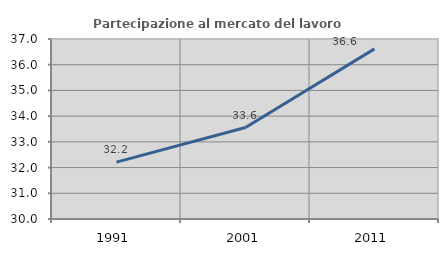
| Category | Partecipazione al mercato del lavoro  femminile |
|---|---|
| 1991.0 | 32.213 |
| 2001.0 | 33.558 |
| 2011.0 | 36.617 |